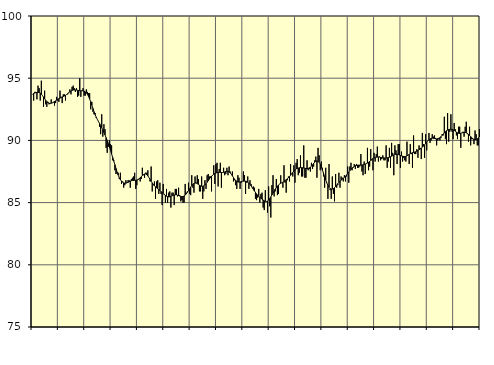
| Category | Piggar | Series 1 |
|---|---|---|
| nan | 93.7 | 93.71 |
| 87.0 | 93.2 | 93.78 |
| 87.0 | 93.9 | 93.81 |
| 87.0 | 93.9 | 93.83 |
| 87.0 | 93.3 | 93.85 |
| 87.0 | 94.4 | 93.86 |
| 87.0 | 94.2 | 93.85 |
| 87.0 | 93.2 | 93.8 |
| 87.0 | 94.8 | 93.72 |
| 87.0 | 93.6 | 93.61 |
| 87.0 | 92.7 | 93.48 |
| 87.0 | 94 | 93.35 |
| nan | 92.9 | 93.22 |
| 88.0 | 92.7 | 93.12 |
| 88.0 | 93.1 | 93.04 |
| 88.0 | 92.9 | 92.99 |
| 88.0 | 93 | 92.97 |
| 88.0 | 93.3 | 92.99 |
| 88.0 | 93 | 93.02 |
| 88.0 | 93.1 | 93.06 |
| 88.0 | 92.8 | 93.12 |
| 88.0 | 93 | 93.18 |
| 88.0 | 93.5 | 93.24 |
| 88.0 | 93.2 | 93.3 |
| nan | 93.1 | 93.35 |
| 89.0 | 94 | 93.4 |
| 89.0 | 93.5 | 93.45 |
| 89.0 | 93 | 93.49 |
| 89.0 | 93.7 | 93.53 |
| 89.0 | 93.7 | 93.57 |
| 89.0 | 93.2 | 93.62 |
| 89.0 | 93.7 | 93.69 |
| 89.0 | 93.7 | 93.76 |
| 89.0 | 93.8 | 93.84 |
| 89.0 | 94.1 | 93.91 |
| 89.0 | 93.7 | 93.97 |
| nan | 94.3 | 94.02 |
| 90.0 | 94.4 | 94.05 |
| 90.0 | 94.2 | 94.06 |
| 90.0 | 93.9 | 94.06 |
| 90.0 | 94.2 | 94.05 |
| 90.0 | 93.5 | 94.03 |
| 90.0 | 93.6 | 94.01 |
| 90.0 | 95 | 93.99 |
| 90.0 | 93.5 | 93.99 |
| 90.0 | 94 | 93.99 |
| 90.0 | 94.2 | 93.98 |
| 90.0 | 93.6 | 93.96 |
| nan | 93.6 | 93.91 |
| 91.0 | 94.1 | 93.82 |
| 91.0 | 93.9 | 93.7 |
| 91.0 | 93.8 | 93.53 |
| 91.0 | 93.8 | 93.33 |
| 91.0 | 92.5 | 93.1 |
| 91.0 | 93.1 | 92.84 |
| 91.0 | 92.3 | 92.57 |
| 91.0 | 92.1 | 92.3 |
| 91.0 | 92.2 | 92.07 |
| 91.0 | 91.8 | 91.86 |
| 91.0 | 91.7 | 91.69 |
| nan | 91.5 | 91.53 |
| 92.0 | 91.1 | 91.37 |
| 92.0 | 90.5 | 91.21 |
| 92.0 | 92.1 | 91.03 |
| 92.0 | 90.3 | 90.84 |
| 92.0 | 91.3 | 90.64 |
| 92.0 | 90.9 | 90.44 |
| 92.0 | 89.4 | 90.22 |
| 92.0 | 89 | 89.99 |
| 92.0 | 89.5 | 89.74 |
| 92.0 | 90 | 89.47 |
| 92.0 | 89.7 | 89.2 |
| nan | 89.6 | 88.91 |
| 93.0 | 88.4 | 88.62 |
| 93.0 | 88.4 | 88.33 |
| 93.0 | 87.6 | 88.04 |
| 93.0 | 87.3 | 87.74 |
| 93.0 | 87.4 | 87.46 |
| 93.0 | 87.4 | 87.21 |
| 93.0 | 86.9 | 87 |
| 93.0 | 87.4 | 86.84 |
| 93.0 | 86.5 | 86.73 |
| 93.0 | 86.7 | 86.64 |
| 93.0 | 86.2 | 86.59 |
| nan | 86.4 | 86.56 |
| 94.0 | 86.8 | 86.56 |
| 94.0 | 86.6 | 86.59 |
| 94.0 | 86.8 | 86.63 |
| 94.0 | 86.8 | 86.68 |
| 94.0 | 86.2 | 86.73 |
| 94.0 | 86.9 | 86.76 |
| 94.0 | 87 | 86.78 |
| 94.0 | 87.1 | 86.78 |
| 94.0 | 87.4 | 86.79 |
| 94.0 | 86.1 | 86.79 |
| 94.0 | 86.4 | 86.81 |
| nan | 86.9 | 86.85 |
| 95.0 | 86.9 | 86.91 |
| 95.0 | 86.7 | 86.99 |
| 95.0 | 86.9 | 87.08 |
| 95.0 | 87.8 | 87.17 |
| 95.0 | 87.2 | 87.25 |
| 95.0 | 87 | 87.3 |
| 95.0 | 87.4 | 87.3 |
| 95.0 | 87.4 | 87.25 |
| 95.0 | 87.6 | 87.15 |
| 95.0 | 87 | 87.01 |
| 95.0 | 86.7 | 86.87 |
| nan | 87.9 | 86.72 |
| 96.0 | 85.9 | 86.58 |
| 96.0 | 86.4 | 86.46 |
| 96.0 | 86.7 | 86.35 |
| 96.0 | 85.3 | 86.27 |
| 96.0 | 86.7 | 86.19 |
| 96.0 | 86.8 | 86.11 |
| 96.0 | 85.7 | 86.04 |
| 96.0 | 86.6 | 85.97 |
| 96.0 | 85.7 | 85.89 |
| 96.0 | 84.8 | 85.81 |
| 96.0 | 86.5 | 85.73 |
| nan | 85.7 | 85.64 |
| 97.0 | 85 | 85.57 |
| 97.0 | 86.1 | 85.52 |
| 97.0 | 85 | 85.48 |
| 97.0 | 85.8 | 85.46 |
| 97.0 | 85.9 | 85.47 |
| 97.0 | 84.6 | 85.5 |
| 97.0 | 85.8 | 85.54 |
| 97.0 | 85.8 | 85.58 |
| 97.0 | 84.8 | 85.61 |
| 97.0 | 86.1 | 85.63 |
| 97.0 | 86.1 | 85.63 |
| nan | 85.5 | 85.6 |
| 98.0 | 86.2 | 85.57 |
| 98.0 | 85.6 | 85.53 |
| 98.0 | 85.1 | 85.5 |
| 98.0 | 85.2 | 85.48 |
| 98.0 | 85 | 85.49 |
| 98.0 | 85 | 85.53 |
| 98.0 | 86.5 | 85.6 |
| 98.0 | 85.8 | 85.7 |
| 98.0 | 85.9 | 85.82 |
| 98.0 | 86.6 | 85.97 |
| 98.0 | 85.7 | 86.11 |
| nan | 85.6 | 86.25 |
| 99.0 | 87.2 | 86.37 |
| 99.0 | 86.2 | 86.47 |
| 99.0 | 85.8 | 86.54 |
| 99.0 | 87.1 | 86.57 |
| 99.0 | 86.6 | 86.57 |
| 99.0 | 87.2 | 86.53 |
| 99.0 | 86.9 | 86.47 |
| 99.0 | 85.9 | 86.4 |
| 99.0 | 85.9 | 86.35 |
| 99.0 | 87.1 | 86.32 |
| 99.0 | 85.3 | 86.31 |
| nan | 85.9 | 86.35 |
| 0.0 | 86.8 | 86.42 |
| 0.0 | 86.1 | 86.51 |
| 0.0 | 87.2 | 86.63 |
| 0.0 | 87.3 | 86.76 |
| 0.0 | 87.1 | 86.89 |
| 0.0 | 87.1 | 87.02 |
| 0.0 | 85.9 | 87.12 |
| 0.0 | 87.2 | 87.21 |
| 0.0 | 88 | 87.28 |
| 0.0 | 86.5 | 87.34 |
| 0.0 | 88.1 | 87.38 |
| nan | 88.2 | 87.41 |
| 1.0 | 86.3 | 87.43 |
| 1.0 | 87.7 | 87.43 |
| 1.0 | 88.2 | 87.43 |
| 1.0 | 86.2 | 87.42 |
| 1.0 | 87.4 | 87.42 |
| 1.0 | 87.8 | 87.43 |
| 1.0 | 87.2 | 87.46 |
| 1.0 | 87.3 | 87.5 |
| 1.0 | 87.8 | 87.51 |
| 1.0 | 87.2 | 87.51 |
| 1.0 | 87.9 | 87.47 |
| nan | 87.5 | 87.39 |
| 2.0 | 87.3 | 87.29 |
| 2.0 | 87.5 | 87.15 |
| 2.0 | 86.7 | 87.01 |
| 2.0 | 86.8 | 86.88 |
| 2.0 | 86.4 | 86.78 |
| 2.0 | 86.1 | 86.71 |
| 2.0 | 87.2 | 86.66 |
| 2.0 | 87 | 86.65 |
| 2.0 | 86.1 | 86.66 |
| 2.0 | 86.6 | 86.68 |
| 2.0 | 86.7 | 86.71 |
| nan | 87.5 | 86.72 |
| 3.0 | 87.2 | 86.73 |
| 3.0 | 85.7 | 86.72 |
| 3.0 | 86.6 | 86.7 |
| 3.0 | 87.1 | 86.64 |
| 3.0 | 86.1 | 86.57 |
| 3.0 | 86.8 | 86.47 |
| 3.0 | 86.5 | 86.34 |
| 3.0 | 86.2 | 86.21 |
| 3.0 | 86.3 | 86.08 |
| 3.0 | 86.2 | 85.94 |
| 3.0 | 85.3 | 85.82 |
| nan | 85.2 | 85.7 |
| 4.0 | 85.4 | 85.58 |
| 4.0 | 86.1 | 85.5 |
| 4.0 | 85 | 85.43 |
| 4.0 | 85.7 | 85.35 |
| 4.0 | 85.8 | 85.28 |
| 4.0 | 84.6 | 85.21 |
| 4.0 | 84.4 | 85.14 |
| 4.0 | 86 | 85.1 |
| 4.0 | 85.1 | 85.09 |
| 4.0 | 84.2 | 85.12 |
| 4.0 | 86.3 | 85.2 |
| nan | 84.7 | 85.32 |
| 5.0 | 83.8 | 85.46 |
| 5.0 | 86.4 | 85.62 |
| 5.0 | 87.2 | 85.78 |
| 5.0 | 85.5 | 85.93 |
| 5.0 | 85.9 | 86.08 |
| 5.0 | 86.9 | 86.21 |
| 5.0 | 85.6 | 86.33 |
| 5.0 | 85.7 | 86.42 |
| 5.0 | 86.5 | 86.49 |
| 5.0 | 87.2 | 86.55 |
| 5.0 | 86.6 | 86.6 |
| nan | 86.2 | 86.65 |
| 6.0 | 88 | 86.71 |
| 6.0 | 86.6 | 86.78 |
| 6.0 | 85.8 | 86.84 |
| 6.0 | 86.8 | 86.91 |
| 6.0 | 87.1 | 86.99 |
| 6.0 | 86.7 | 87.09 |
| 6.0 | 88.1 | 87.2 |
| 6.0 | 87.3 | 87.32 |
| 6.0 | 87.1 | 87.43 |
| 6.0 | 88 | 87.54 |
| 6.0 | 86.6 | 87.63 |
| nan | 88.2 | 87.71 |
| 7.0 | 88.5 | 87.75 |
| 7.0 | 87.2 | 87.78 |
| 7.0 | 87.4 | 87.8 |
| 7.0 | 88.8 | 87.81 |
| 7.0 | 87.1 | 87.81 |
| 7.0 | 87.1 | 87.8 |
| 7.0 | 89.6 | 87.78 |
| 7.0 | 87 | 87.76 |
| 7.0 | 87 | 87.74 |
| 7.0 | 88.4 | 87.73 |
| 7.0 | 87.6 | 87.75 |
| nan | 87.7 | 87.79 |
| 8.0 | 87.5 | 87.85 |
| 8.0 | 88.2 | 87.93 |
| 8.0 | 87.7 | 88.04 |
| 8.0 | 87.9 | 88.15 |
| 8.0 | 88.4 | 88.25 |
| 8.0 | 88.7 | 88.33 |
| 8.0 | 87 | 88.35 |
| 8.0 | 89.4 | 88.32 |
| 8.0 | 88.8 | 88.23 |
| 8.0 | 87.6 | 88.08 |
| 8.0 | 88.3 | 87.87 |
| nan | 87.8 | 87.62 |
| 9.0 | 87.1 | 87.36 |
| 9.0 | 86.2 | 87.08 |
| 9.0 | 87.8 | 86.82 |
| 9.0 | 86.6 | 86.58 |
| 9.0 | 85.3 | 86.38 |
| 9.0 | 88.1 | 86.23 |
| 9.0 | 86 | 86.13 |
| 9.0 | 85.3 | 86.09 |
| 9.0 | 87.1 | 86.09 |
| 9.0 | 85.7 | 86.13 |
| 9.0 | 85.1 | 86.2 |
| nan | 87.3 | 86.3 |
| 10.0 | 86.2 | 86.41 |
| 10.0 | 86.4 | 86.53 |
| 10.0 | 87.4 | 86.63 |
| 10.0 | 86.2 | 86.72 |
| 10.0 | 87.1 | 86.8 |
| 10.0 | 87 | 86.88 |
| 10.0 | 86.7 | 86.95 |
| 10.0 | 87.2 | 87.03 |
| 10.0 | 86.7 | 87.12 |
| 10.0 | 87.1 | 87.22 |
| 10.0 | 87.9 | 87.34 |
| nan | 86.6 | 87.46 |
| 11.0 | 87.9 | 87.57 |
| 11.0 | 88.2 | 87.67 |
| 11.0 | 87.6 | 87.77 |
| 11.0 | 87.8 | 87.85 |
| 11.0 | 88.1 | 87.92 |
| 11.0 | 87.7 | 87.97 |
| 11.0 | 88.1 | 87.99 |
| 11.0 | 87.8 | 88.01 |
| 11.0 | 87.8 | 88.01 |
| 11.0 | 87.9 | 88.01 |
| 11.0 | 88.9 | 88.02 |
| nan | 87.5 | 88.02 |
| 12.0 | 87.2 | 88.04 |
| 12.0 | 88.3 | 88.07 |
| 12.0 | 87.3 | 88.09 |
| 12.0 | 88.1 | 88.13 |
| 12.0 | 89.4 | 88.18 |
| 12.0 | 87.6 | 88.24 |
| 12.0 | 87.9 | 88.31 |
| 12.0 | 89.3 | 88.39 |
| 12.0 | 88.4 | 88.47 |
| 12.0 | 87.6 | 88.54 |
| 12.0 | 89 | 88.59 |
| nan | 88.3 | 88.62 |
| 13.0 | 88.9 | 88.65 |
| 13.0 | 89.5 | 88.66 |
| 13.0 | 88.3 | 88.67 |
| 13.0 | 88.7 | 88.66 |
| 13.0 | 88.4 | 88.64 |
| 13.0 | 88.5 | 88.61 |
| 13.0 | 88.8 | 88.6 |
| 13.0 | 88.4 | 88.59 |
| 13.0 | 88.4 | 88.58 |
| 13.0 | 89.6 | 88.59 |
| 13.0 | 87.8 | 88.6 |
| nan | 88.3 | 88.62 |
| 14.0 | 89.4 | 88.65 |
| 14.0 | 87.8 | 88.69 |
| 14.0 | 89.8 | 88.73 |
| 14.0 | 89 | 88.78 |
| 14.0 | 87.2 | 88.83 |
| 14.0 | 89.6 | 88.87 |
| 14.0 | 89.2 | 88.88 |
| 14.0 | 88.1 | 88.88 |
| 14.0 | 89.7 | 88.87 |
| 14.0 | 89.7 | 88.83 |
| 14.0 | 87.8 | 88.79 |
| nan | 89.1 | 88.76 |
| 15.0 | 88.3 | 88.73 |
| 15.0 | 88.6 | 88.71 |
| 15.0 | 88.4 | 88.7 |
| 15.0 | 88.3 | 88.72 |
| 15.0 | 89.9 | 88.76 |
| 15.0 | 88.8 | 88.81 |
| 15.0 | 88.1 | 88.88 |
| 15.0 | 89.7 | 88.93 |
| 15.0 | 88.9 | 88.98 |
| 15.0 | 87.8 | 89.01 |
| 15.0 | 90.4 | 89.03 |
| nan | 88.9 | 89.06 |
| 16.0 | 88.9 | 89.09 |
| 16.0 | 89.3 | 89.13 |
| 16.0 | 88.6 | 89.18 |
| 16.0 | 89.6 | 89.24 |
| 16.0 | 89.4 | 89.3 |
| 16.0 | 88.5 | 89.37 |
| 16.0 | 90.6 | 89.45 |
| 16.0 | 89.7 | 89.54 |
| 16.0 | 88.6 | 89.64 |
| 16.0 | 90.5 | 89.75 |
| 16.0 | 89.2 | 89.87 |
| nan | 90 | 89.97 |
| 17.0 | 90.6 | 90.05 |
| 17.0 | 89.8 | 90.12 |
| 17.0 | 90 | 90.16 |
| 17.0 | 90.5 | 90.18 |
| 17.0 | 90.3 | 90.17 |
| 17.0 | 90.4 | 90.15 |
| 17.0 | 90.2 | 90.13 |
| 17.0 | 89.6 | 90.12 |
| 17.0 | 90 | 90.14 |
| 17.0 | 90.1 | 90.17 |
| 17.0 | 90 | 90.22 |
| nan | 90.2 | 90.3 |
| 18.0 | 90.5 | 90.4 |
| 18.0 | 90.4 | 90.5 |
| 18.0 | 91.9 | 90.6 |
| 18.0 | 90.1 | 90.7 |
| 18.0 | 89.7 | 90.78 |
| 18.0 | 92.2 | 90.83 |
| 18.0 | 89.9 | 90.87 |
| 18.0 | 90.7 | 90.89 |
| 18.0 | 92.1 | 90.89 |
| 18.0 | 90.7 | 90.88 |
| 18.0 | 90.1 | 90.85 |
| nan | 91.4 | 90.8 |
| 19.0 | 90.9 | 90.74 |
| 19.0 | 90.4 | 90.67 |
| 19.0 | 90.1 | 90.61 |
| 19.0 | 91.1 | 90.57 |
| 19.0 | 91.1 | 90.56 |
| 19.0 | 89.4 | 90.57 |
| 19.0 | 90.6 | 90.6 |
| 19.0 | 90.7 | 90.63 |
| 19.0 | 90.3 | 90.65 |
| 19.0 | 91.1 | 90.64 |
| 19.0 | 91.5 | 90.62 |
| nan | 90.5 | 90.57 |
| 20.0 | 89.9 | 90.49 |
| 20.0 | 91.1 | 90.4 |
| 20.0 | 89.6 | 90.31 |
| 20.0 | 90.1 | 90.21 |
| 20.0 | 90.1 | 90.13 |
| 20.0 | 89.7 | 90.08 |
| 20.0 | 90.8 | 90.06 |
| 20.0 | 90.5 | 90.08 |
| 20.0 | 89.6 | 90.12 |
| 20.0 | 89.6 | 90.19 |
| 20.0 | 90.9 | 90.28 |